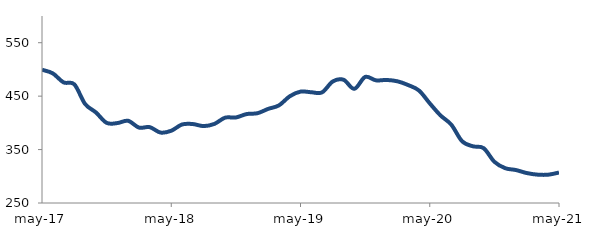
| Category | Series 0 |
|---|---|
| 2017-05-01 | 499.403 |
| 2017-06-01 | 492.658 |
| 2017-07-01 | 475.773 |
| 2017-08-01 | 472.095 |
| 2017-09-01 | 435.36 |
| 2017-10-01 | 419.613 |
| 2017-11-01 | 399.993 |
| 2017-12-01 | 399.593 |
| 2018-01-01 | 403.819 |
| 2018-02-01 | 391.148 |
| 2018-03-01 | 391.982 |
| 2018-04-01 | 381.858 |
| 2018-05-01 | 385.253 |
| 2018-06-01 | 396.938 |
| 2018-07-01 | 397.791 |
| 2018-08-01 | 393.946 |
| 2018-09-01 | 397.991 |
| 2018-10-01 | 409.681 |
| 2018-11-01 | 410.109 |
| 2018-12-01 | 416.457 |
| 2019-01-01 | 418.023 |
| 2019-02-01 | 426.141 |
| 2019-03-01 | 432.718 |
| 2019-04-01 | 449.714 |
| 2019-05-01 | 458.458 |
| 2019-06-01 | 457.312 |
| 2019-07-01 | 457.058 |
| 2019-08-01 | 477.544 |
| 2019-09-01 | 480.652 |
| 2019-10-01 | 463.67 |
| 2019-11-01 | 485.887 |
| 2019-12-01 | 479.593 |
| 2020-01-01 | 480.293 |
| 2020-02-01 | 477.774 |
| 2020-03-01 | 470.708 |
| 2020-04-01 | 460.537 |
| 2020-05-01 | 436.562 |
| 2020-06-01 | 413.857 |
| 2020-07-01 | 396.652 |
| 2020-08-01 | 365.687 |
| 2020-09-01 | 356.18 |
| 2020-10-01 | 352.658 |
| 2020-11-01 | 327.164 |
| 2020-12-01 | 315.173 |
| 2021-01-01 | 311.708 |
| 2021-02-01 | 306.103 |
| 2021-03-01 | 303.075 |
| 2021-04-01 | 303.034 |
| 2021-05-01 | 306.996 |